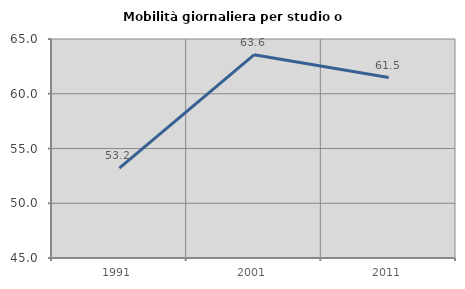
| Category | Mobilità giornaliera per studio o lavoro |
|---|---|
| 1991.0 | 53.216 |
| 2001.0 | 63.553 |
| 2011.0 | 61.48 |